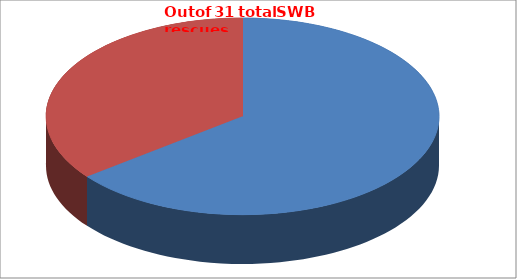
| Category | Series 0 |
|---|---|
| 0 | 20 |
| 1 | 11 |